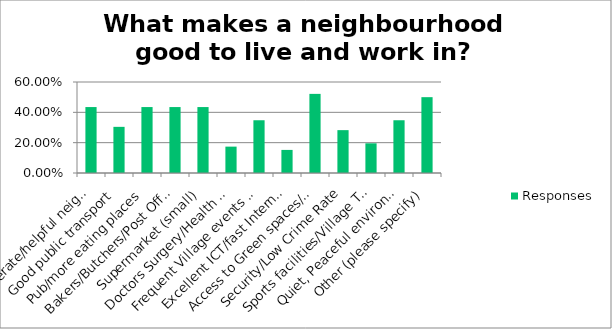
| Category | Responses |
|---|---|
| Considerate/helpful neighbours | 0.435 |
| Good public transport | 0.304 |
| Pub/more eating places | 0.435 |
| Bakers/Butchers/Post Office/Greencrocers/Newsagent | 0.435 |
| Supermarket (small) | 0.435 |
| Doctors Surgery/Health services | 0.174 |
| Frequent Village events and activities | 0.348 |
| Excellent ICT/fast Internet Speed | 0.152 |
| Access to Green spaces/Open Green Spaces | 0.522 |
| Security/Low Crime Rate | 0.283 |
| Sports facilities/Village Teams | 0.196 |
| Quiet, Peaceful environment | 0.348 |
| Other (please specify) | 0.5 |